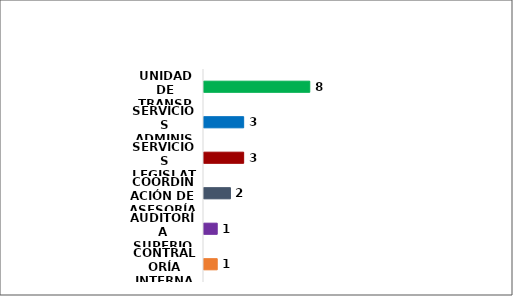
| Category | Series 0 |
|---|---|
| CONTRALORÍA INTERNA | 1 |
| AUDITORÍA SUPERIOR | 1 |
| COORDINACIÓN DE ASESORÍA | 2 |
| SERVICIOS LEGISLATIVOS | 3 |
| SERVICIOS ADMINISTRATIVOS | 3 |
| UNIDAD DE TRANSPARENCIA | 8 |